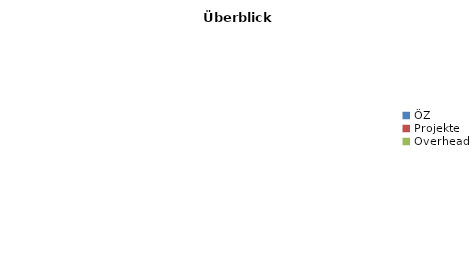
| Category | Series 0 |
|---|---|
| ÖZ | 0 |
| Projekte | 0 |
| Overhead | 0 |